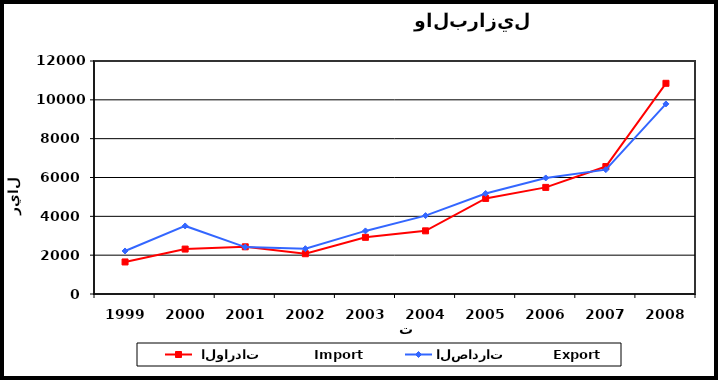
| Category |  الواردات           Import | الصادرات          Export |
|---|---|---|
| 1999.0 | 1650 | 2216 |
| 2000.0 | 2314 | 3505 |
| 2001.0 | 2431 | 2417 |
| 2002.0 | 2074 | 2335 |
| 2003.0 | 2919 | 3249 |
| 2004.0 | 3253 | 4038 |
| 2005.0 | 4922 | 5178 |
| 2006.0 | 5490 | 5977 |
| 2007.0 | 6564 | 6405 |
| 2008.0 | 10851 | 9790 |